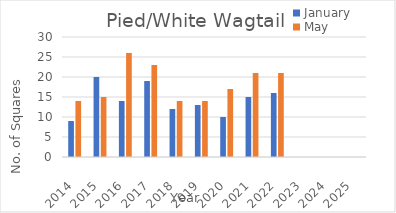
| Category | January | May |
|---|---|---|
| 2014.0 | 9 | 14 |
| 2015.0 | 20 | 15 |
| 2016.0 | 14 | 26 |
| 2017.0 | 19 | 23 |
| 2018.0 | 12 | 14 |
| 2019.0 | 13 | 14 |
| 2020.0 | 10 | 17 |
| 2021.0 | 15 | 21 |
| 2022.0 | 16 | 21 |
| 2023.0 | 0 | 0 |
| 2024.0 | 0 | 0 |
| 2025.0 | 0 | 0 |